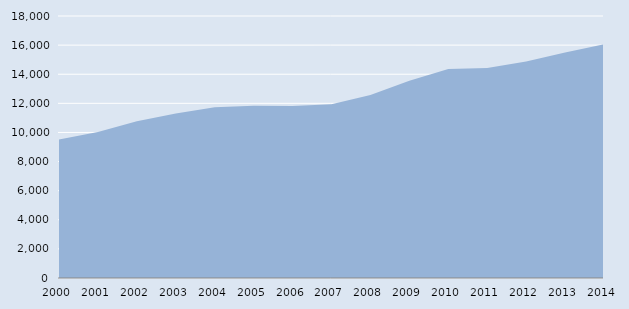
| Category | Series 0 |
|---|---|
| 2000.0 | 9509 |
| 2001.0 | 10030 |
| 2002.0 | 10762 |
| 2003.0 | 11300 |
| 2004.0 | 11729 |
| 2005.0 | 11833 |
| 2006.0 | 11823 |
| 2007.0 | 11940 |
| 2008.0 | 12569 |
| 2009.0 | 13553 |
| 2010.0 | 14356 |
| 2011.0 | 14430 |
| 2012.0 | 14868 |
| 2013.0 | 15486 |
| 2014.0 | 16054 |